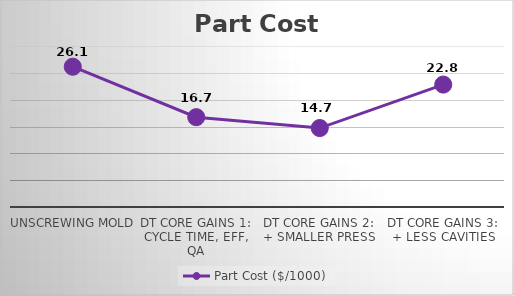
| Category | Part Cost ($/1000) |
|---|---|
| Unscrewing Mold | 26.139 |
| DT Core Gains 1:
Cycle Time, Eff, QA | 16.735 |
| DT Core Gains 2:
+ Smaller Press | 14.71 |
| DT Core Gains 3:
+ Less Cavities | 22.812 |